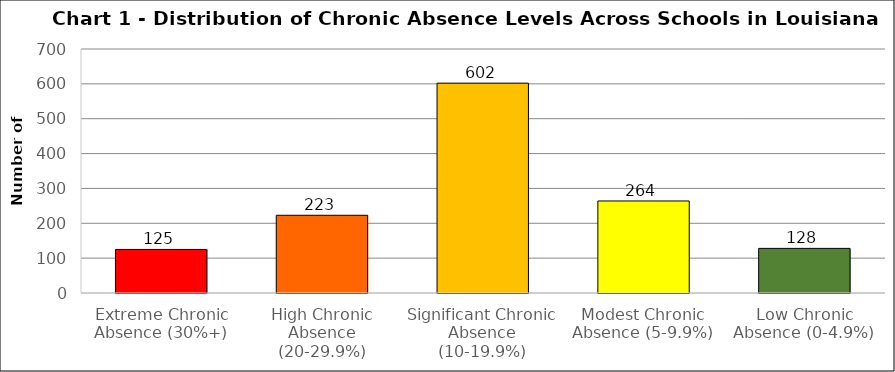
| Category | Series 0 |
|---|---|
| Extreme Chronic Absence (30%+) | 125 |
| High Chronic Absence (20-29.9%) | 223 |
| Significant Chronic Absence (10-19.9%) | 602 |
| Modest Chronic Absence (5-9.9%) | 264 |
| Low Chronic Absence (0-4.9%) | 128 |